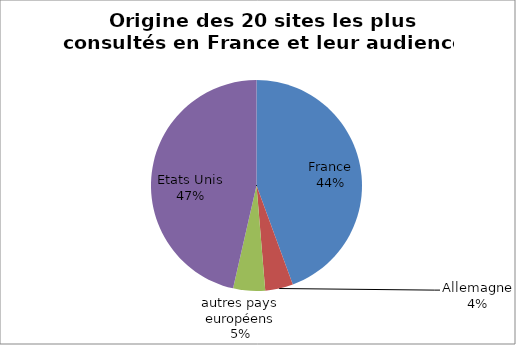
| Category | Series 0 |
|---|---|
| 0 | 0.444 |
| 1 | 0.043 |
| 2 | 0.049 |
| 3 | 0.464 |